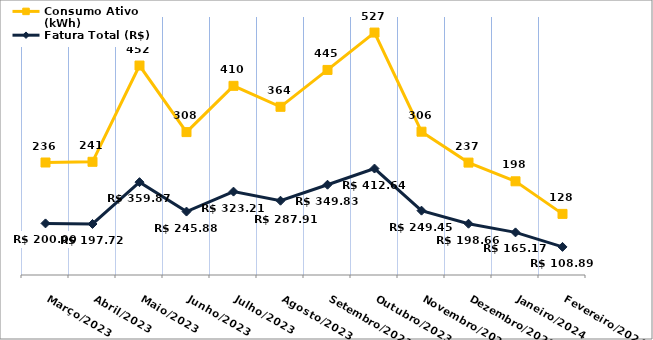
| Category | Fatura Total (R$) | Consumo Ativo (kWh) |
|---|---|---|
| Março/2023 | 200 | 236 |
| Abril/2023 | 197.72 | 241 |
| Maio/2023 | 359.87 | 452 |
| Junho/2023 | 245.88 | 308 |
| Julho/2023 | 323.21 | 410 |
| Agosto/2023 | 287.91 | 364 |
| Setembro/2023 | 349.83 | 445 |
| Outubro/2023 | 412.64 | 527 |
| Novembro/2023 | 249.45 | 306 |
| Dezembro/2023 | 198.66 | 237 |
| Janeiro/2024 | 165.17 | 198 |
| Fevereiro/2024 | 108.89 | 128 |